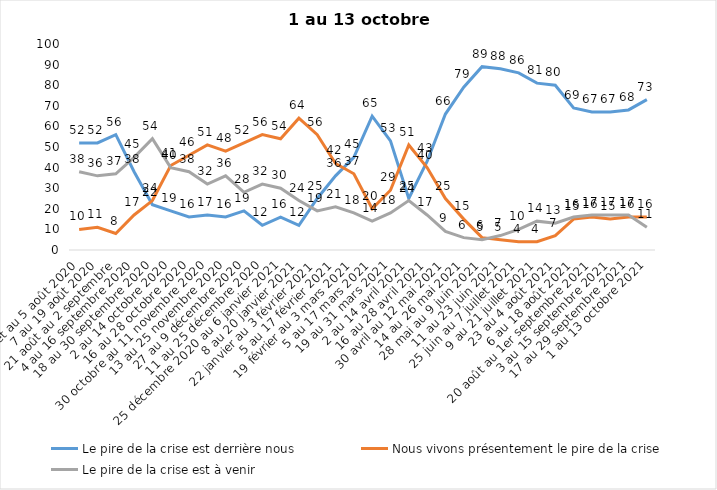
| Category | Le pire de la crise est derrière nous | Nous vivons présentement le pire de la crise | Le pire de la crise est à venir |
|---|---|---|---|
| 24 juillet au 5 août 2020 | 52 | 10 | 38 |
| 7 au 19 août 2020 | 52 | 11 | 36 |
| 21 août au 2 septembre | 56 | 8 | 37 |
| 4 au 16 septembre 2020 | 38 | 17 | 45 |
| 18 au 30 septembre 2020 | 22 | 24 | 54 |
| 2 au 14 octobre 2020 | 19 | 41 | 40 |
| 16 au 28 octobre 2020 | 16 | 46 | 38 |
| 30 octobre au 11 novembre 2020 | 17 | 51 | 32 |
| 13 au 25 novembre 2020 | 16 | 48 | 36 |
| 27 au 9 décembre 2020 | 19 | 52 | 28 |
| 11 au 25 décembre 2020 | 12 | 56 | 32 |
| 25 décembre 2020 au 6 janvier 2021 | 16 | 54 | 30 |
| 8 au 20 janvier 2021 | 12 | 64 | 24 |
| 22 janvier au 3 février 2021 | 25 | 56 | 19 |
| 5 au 17 février 2021 | 36 | 42 | 21 |
| 19 février au 3 mars 2021 | 45 | 37 | 18 |
| 5 au 17 mars 2021 | 65 | 20 | 14 |
| 19 au 31 mars 2021 | 53 | 29 | 18 |
| 2 au 14 avril 2021 | 25 | 51 | 24 |
| 16 au 28 avril 2021 | 43 | 40 | 17 |
| 30 avril au 12 mai 2021 | 66 | 25 | 9 |
| 14 au 26 mai 2021 | 79 | 15 | 6 |
| 28 mai au 9 juin 2021 | 89 | 6 | 5 |
| 11 au 23 juin 2021 | 88 | 5 | 7 |
| 25 juin au 7 juillet 2021 | 86 | 4 | 10 |
| 9 au 21 juillet 2021 | 81 | 4 | 14 |
| 23 au 4 août 2021 | 80 | 7 | 13 |
| 6 au 18 août 2021 | 69 | 15 | 16 |
| 20 août au 1er septembre 2021 | 67 | 16 | 17 |
| 3 au 15 septembre 2021 | 67 | 15 | 17 |
| 17 au 29 septembre 2021 | 68 | 16 | 17 |
| 1 au 13 octobre 2021 | 73 | 16 | 11 |